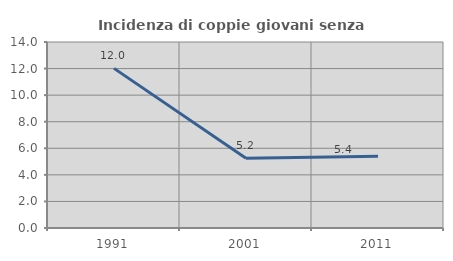
| Category | Incidenza di coppie giovani senza figli |
|---|---|
| 1991.0 | 12.016 |
| 2001.0 | 5.243 |
| 2011.0 | 5.405 |